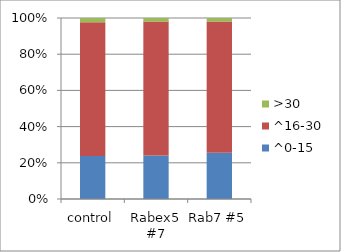
| Category | ^0-15 | ^16-30 | >30 |
|---|---|---|---|
| control | 23.81 | 73.81 | 2.381 |
| Rabex5 #7 | 24 | 74 | 2 |
| Rab7 #5 | 25.49 | 72.549 | 1.961 |